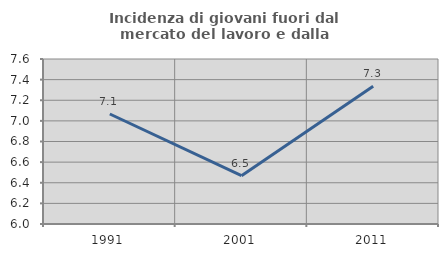
| Category | Incidenza di giovani fuori dal mercato del lavoro e dalla formazione  |
|---|---|
| 1991.0 | 7.067 |
| 2001.0 | 6.468 |
| 2011.0 | 7.337 |